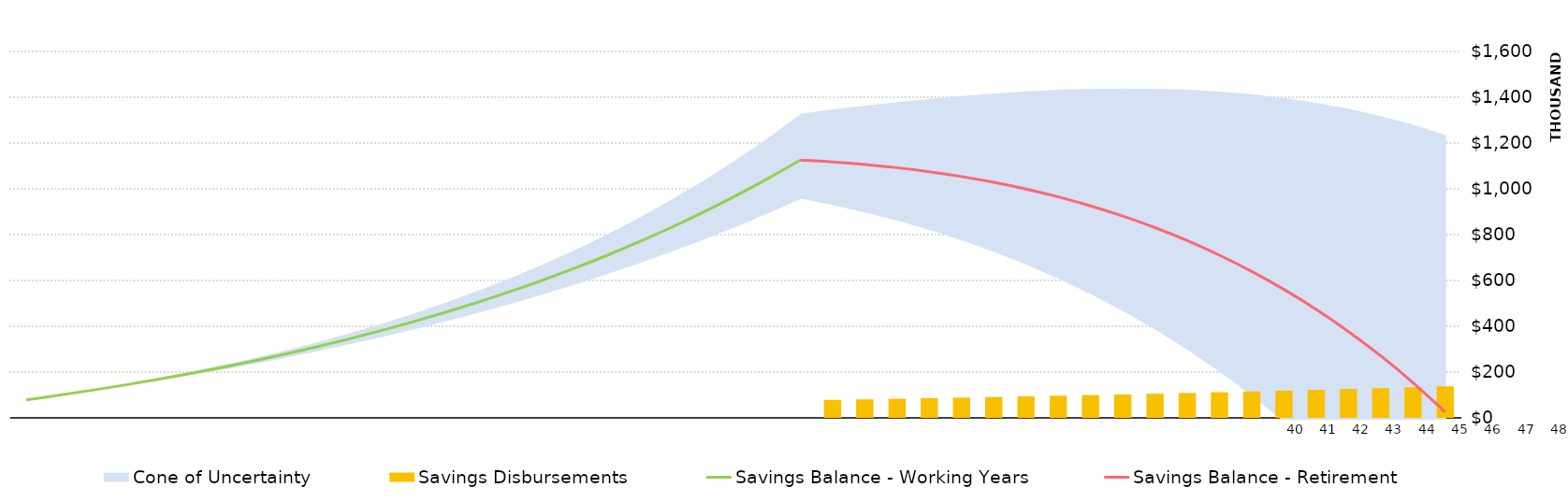
| Category | Savings Disbursements |
|---|---|
| 0 | 0 |
| 1 | 0 |
| 2 | 0 |
| 3 | 0 |
| 4 | 0 |
| 5 | 0 |
| 6 | 0 |
| 7 | 0 |
| 8 | 0 |
| 9 | 0 |
| 10 | 0 |
| 11 | 0 |
| 12 | 0 |
| 13 | 0 |
| 14 | 0 |
| 15 | 0 |
| 16 | 0 |
| 17 | 0 |
| 18 | 0 |
| 19 | 0 |
| 20 | 0 |
| 21 | 0 |
| 22 | 0 |
| 23 | 0 |
| 24 | 0 |
| 25 | 78516.672 |
| 26 | 80872.173 |
| 27 | 83298.338 |
| 28 | 85797.288 |
| 29 | 88371.206 |
| 30 | 91022.343 |
| 31 | 93753.013 |
| 32 | 96565.603 |
| 33 | 99462.571 |
| 34 | 102446.449 |
| 35 | 105519.842 |
| 36 | 108685.437 |
| 37 | 111946 |
| 38 | 115304.38 |
| 39 | 118763.512 |
| 40 | 122326.417 |
| 41 | 125996.21 |
| 42 | 129776.096 |
| 43 | 133669.379 |
| 44 | 137679.46 |